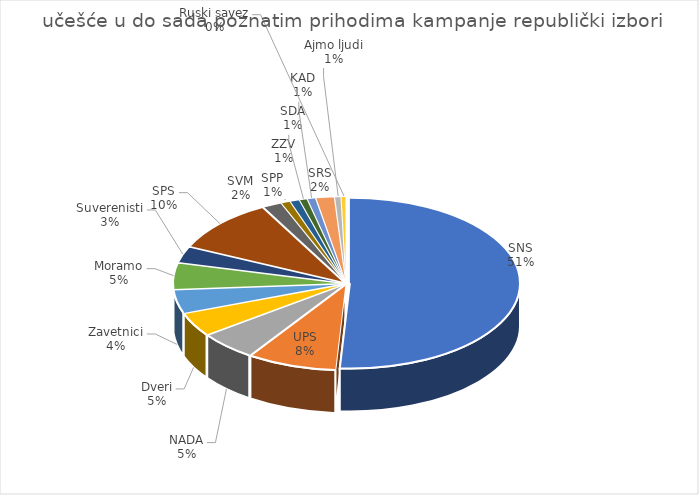
| Category | Series 7 |
|---|---|
| SNS | 9560846.123 |
| UPS | 1592109.99 |
| NADA | 1025471.3 |
| Dveri | 847278.201 |
| Zavetnici | 835032.685 |
| Moramo | 935887.346 |
| Suverenisti | 577161.353 |
| SPS | 1899127.404 |
| SVM | 339291.435 |
| SPP | 164480.096 |
| ZZV | 169587.222 |
| SDA | 139381.39 |
| KAD | 150386.897 |
| SRS | 329428.278 |
| Ajmo ljudi | 113376.692 |
| Ruski savez | 87118.696 |